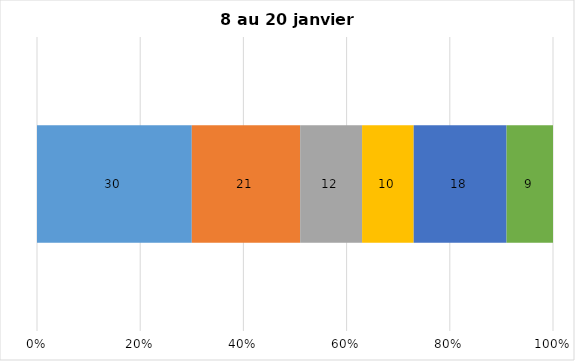
| Category | Plusieurs fois par jour | Une fois par jour | Quelques fois par semaine   | Une fois par semaine ou moins   |  Jamais   |  Je n’utilise pas les médias sociaux |
|---|---|---|---|---|---|---|
| 0 | 30 | 21 | 12 | 10 | 18 | 9 |